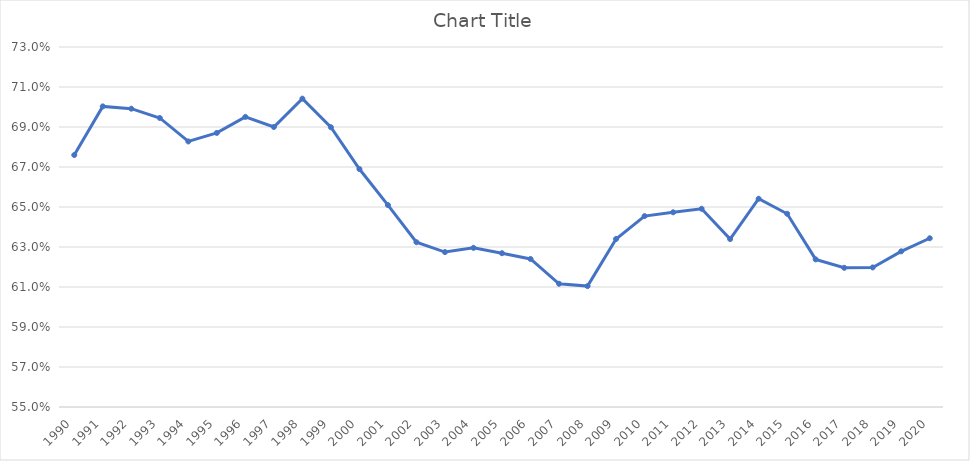
| Category | Series 0 |
|---|---|
| 1990.0 | 0.676 |
| 1991.0 | 0.7 |
| 1992.0 | 0.699 |
| 1993.0 | 0.695 |
| 1994.0 | 0.683 |
| 1995.0 | 0.687 |
| 1996.0 | 0.695 |
| 1997.0 | 0.69 |
| 1998.0 | 0.704 |
| 1999.0 | 0.69 |
| 2000.0 | 0.669 |
| 2001.0 | 0.651 |
| 2002.0 | 0.632 |
| 2003.0 | 0.627 |
| 2004.0 | 0.63 |
| 2005.0 | 0.627 |
| 2006.0 | 0.624 |
| 2007.0 | 0.612 |
| 2008.0 | 0.61 |
| 2009.0 | 0.634 |
| 2010.0 | 0.645 |
| 2011.0 | 0.647 |
| 2012.0 | 0.649 |
| 2013.0 | 0.634 |
| 2014.0 | 0.654 |
| 2015.0 | 0.647 |
| 2016.0 | 0.624 |
| 2017.0 | 0.62 |
| 2018.0 | 0.62 |
| 2019.0 | 0.628 |
| 2020.0 | 0.634 |